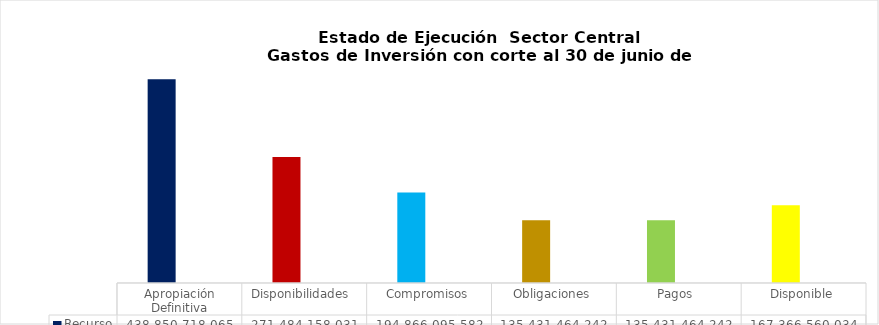
| Category | Recurso  | % |
|---|---|---|
| Apropiación Definitiva | 438850718065.26 | 1 |
| Disponibilidades  | 271484158031.04 | 0.619 |
| Compromisos | 194866095582.45 | 0.444 |
| Obligaciones | 135431464241.63 | 0.309 |
| Pagos  | 135431464241.63 | 0.309 |
| Disponible | 167366560034.22 | 0.381 |